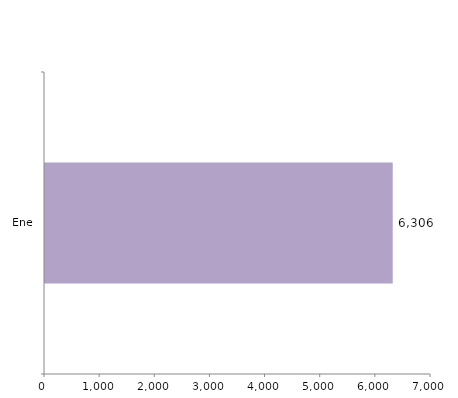
| Category | Series 0 |
|---|---|
| Ene | 6306 |